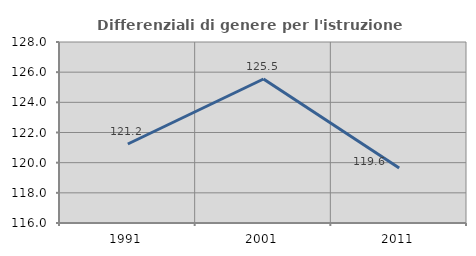
| Category | Differenziali di genere per l'istruzione superiore |
|---|---|
| 1991.0 | 121.239 |
| 2001.0 | 125.548 |
| 2011.0 | 119.64 |